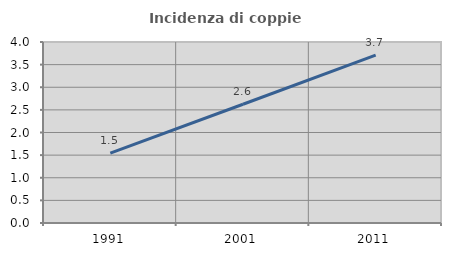
| Category | Incidenza di coppie miste |
|---|---|
| 1991.0 | 1.543 |
| 2001.0 | 2.625 |
| 2011.0 | 3.708 |